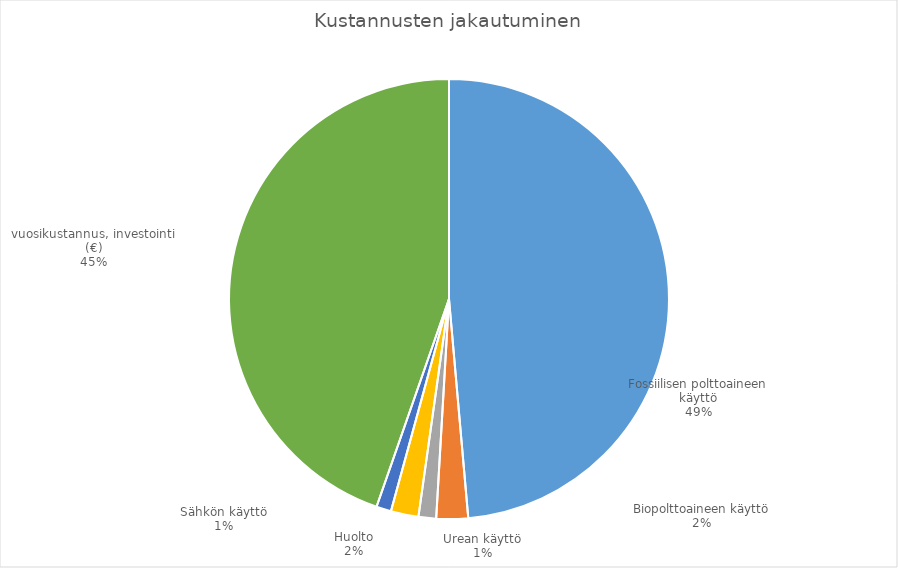
| Category | Series 0 |
|---|---|
| Fossiilisen polttoaineen käyttö | 98092.687 |
| Biopolttoaineen käyttö | 4693.92 |
| Urean käyttö | 2610 |
| Huolto | 4100 |
| Sähkön käyttö | 2194.8 |
| vuosikustannus, investointi (€) | 90135.045 |